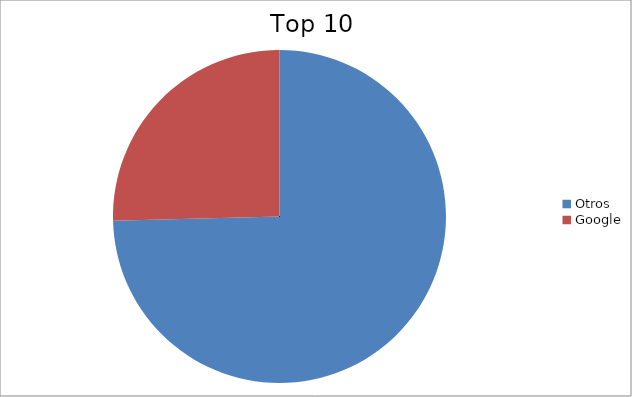
| Category | Series 0 |
|---|---|
| Otros | 74.6 |
| Google | 25.4 |